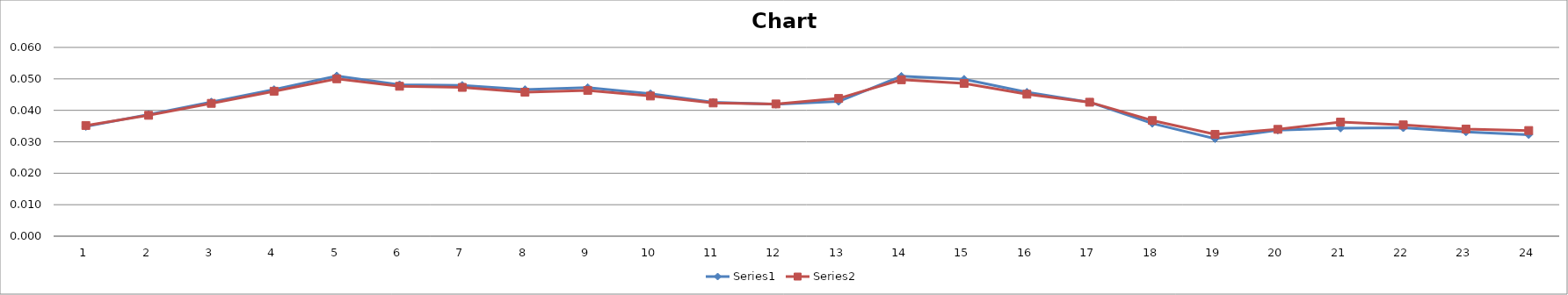
| Category | Series 0 | Series 1 |
|---|---|---|
| 0 | 0.035 | 0.035 |
| 1 | 0.039 | 0.038 |
| 2 | 0.043 | 0.042 |
| 3 | 0.047 | 0.046 |
| 4 | 0.051 | 0.05 |
| 5 | 0.048 | 0.048 |
| 6 | 0.048 | 0.047 |
| 7 | 0.047 | 0.046 |
| 8 | 0.047 | 0.046 |
| 9 | 0.045 | 0.045 |
| 10 | 0.043 | 0.042 |
| 11 | 0.042 | 0.042 |
| 12 | 0.043 | 0.044 |
| 13 | 0.051 | 0.05 |
| 14 | 0.05 | 0.049 |
| 15 | 0.046 | 0.045 |
| 16 | 0.043 | 0.043 |
| 17 | 0.036 | 0.037 |
| 18 | 0.031 | 0.032 |
| 19 | 0.034 | 0.034 |
| 20 | 0.034 | 0.036 |
| 21 | 0.034 | 0.035 |
| 22 | 0.033 | 0.034 |
| 23 | 0.032 | 0.034 |